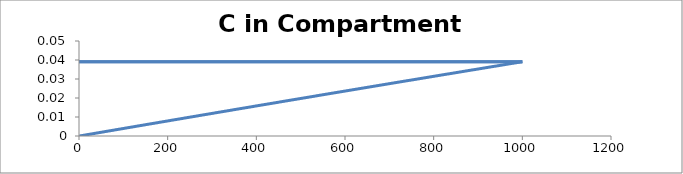
| Category | C - Sys 2 |
|---|---|
| 1.0 | 0 |
| 2.0 | 0 |
| 3.0 | 0 |
| 4.0 | 0 |
| 5.0 | 0 |
| 6.0 | 0 |
| 7.0 | 0 |
| 8.0 | 0 |
| 9.000000000000002 | 0 |
| 10.0 | 0 |
| 11.0 | 0 |
| 12.0 | 0 |
| 13.000000000000002 | 0 |
| 14.0 | 0.001 |
| 15.0 | 0.001 |
| 16.0 | 0.001 |
| 17.0 | 0.001 |
| 18.000000000000004 | 0.001 |
| 19.0 | 0.001 |
| 20.0 | 0.001 |
| 21.0 | 0.001 |
| 22.0 | 0.001 |
| 23.0 | 0.001 |
| 24.0 | 0.001 |
| 25.0 | 0.001 |
| 26.000000000000004 | 0.001 |
| 27.0 | 0.001 |
| 28.0 | 0.001 |
| 29.0 | 0.001 |
| 30.0 | 0.001 |
| 31.0 | 0.001 |
| 32.0 | 0.001 |
| 33.0 | 0.001 |
| 34.0 | 0.001 |
| 35.0 | 0.001 |
| 36.00000000000001 | 0.001 |
| 37.0 | 0.001 |
| 38.0 | 0.001 |
| 39.0 | 0.002 |
| 40.0 | 0.002 |
| 41.0 | 0.002 |
| 42.0 | 0.002 |
| 43.0 | 0.002 |
| 44.0 | 0.002 |
| 45.0 | 0.002 |
| 46.0 | 0.002 |
| 47.0 | 0.002 |
| 48.0 | 0.002 |
| 49.0 | 0.002 |
| 50.0 | 0.002 |
| 51.00000000000001 | 0.002 |
| 52.00000000000001 | 0.002 |
| 53.0 | 0.002 |
| 54.0 | 0.002 |
| 55.0 | 0.002 |
| 56.0 | 0.002 |
| 57.0 | 0.002 |
| 58.0 | 0.002 |
| 59.00000000000001 | 0.002 |
| 60.0 | 0.002 |
| 61.0 | 0.002 |
| 62.0 | 0.002 |
| 63.0 | 0.002 |
| 64.0 | 0.003 |
| 65.0 | 0.003 |
| 66.0 | 0.003 |
| 67.0 | 0.003 |
| 68.0 | 0.003 |
| 69.0 | 0.003 |
| 70.0 | 0.003 |
| 71.00000000000001 | 0.003 |
| 72.00000000000001 | 0.003 |
| 73.0 | 0.003 |
| 74.0 | 0.003 |
| 75.0 | 0.003 |
| 76.0 | 0.003 |
| 77.0 | 0.003 |
| 78.0 | 0.003 |
| 79.0 | 0.003 |
| 80.0 | 0.003 |
| 81.0 | 0.003 |
| 82.0 | 0.003 |
| 83.0 | 0.003 |
| 84.0 | 0.003 |
| 85.0 | 0.003 |
| 86.0 | 0.003 |
| 87.00000000000001 | 0.003 |
| 88.0 | 0.003 |
| 89.0 | 0.004 |
| 90.0 | 0.004 |
| 91.0 | 0.004 |
| 92.0 | 0.004 |
| 93.0 | 0.004 |
| 94.0 | 0.004 |
| 95.0 | 0.004 |
| 96.0 | 0.004 |
| 97.0 | 0.004 |
| 98.0 | 0.004 |
| 99.0 | 0.004 |
| 100.0 | 0.004 |
| 101.0 | 0.004 |
| 102.00000000000001 | 0.004 |
| 103.00000000000001 | 0.004 |
| 104.00000000000001 | 0.004 |
| 105.0 | 0.004 |
| 106.0 | 0.004 |
| 107.0 | 0.004 |
| 108.0 | 0.004 |
| 109.0 | 0.004 |
| 110.0 | 0.004 |
| 111.0 | 0.004 |
| 112.0 | 0.004 |
| 113.0 | 0.004 |
| 114.0 | 0.005 |
| 115.0 | 0.005 |
| 116.0 | 0.005 |
| 117.0 | 0.005 |
| 118.00000000000001 | 0.005 |
| 119.00000000000001 | 0.005 |
| 120.0 | 0.005 |
| 121.0 | 0.005 |
| 122.0 | 0.005 |
| 123.0 | 0.005 |
| 124.0 | 0.005 |
| 125.0 | 0.005 |
| 126.0 | 0.005 |
| 127.0 | 0.005 |
| 128.0 | 0.005 |
| 129.0 | 0.005 |
| 130.0 | 0.005 |
| 131.0 | 0.005 |
| 132.0 | 0.005 |
| 133.0 | 0.005 |
| 134.0 | 0.005 |
| 135.0 | 0.005 |
| 136.0 | 0.005 |
| 137.0 | 0.005 |
| 138.0 | 0.005 |
| 139.0 | 0.006 |
| 140.0 | 0.006 |
| 141.0 | 0.006 |
| 142.00000000000003 | 0.006 |
| 143.00000000000003 | 0.006 |
| 144.00000000000003 | 0.006 |
| 145.0 | 0.006 |
| 146.0 | 0.006 |
| 147.0 | 0.006 |
| 148.0 | 0.006 |
| 149.0 | 0.006 |
| 150.0 | 0.006 |
| 151.0 | 0.006 |
| 152.0 | 0.006 |
| 153.0 | 0.006 |
| 154.0 | 0.006 |
| 155.0 | 0.006 |
| 156.0 | 0.006 |
| 157.0 | 0.006 |
| 158.0 | 0.006 |
| 159.0 | 0.006 |
| 160.0 | 0.006 |
| 161.0 | 0.006 |
| 162.0 | 0.006 |
| 163.0 | 0.006 |
| 164.0 | 0.006 |
| 165.0 | 0.007 |
| 166.0 | 0.007 |
| 167.0 | 0.007 |
| 168.0 | 0.007 |
| 169.0 | 0.007 |
| 170.0 | 0.007 |
| 171.0 | 0.007 |
| 172.0 | 0.007 |
| 173.00000000000003 | 0.007 |
| 174.00000000000003 | 0.007 |
| 175.00000000000003 | 0.007 |
| 176.0 | 0.007 |
| 177.0 | 0.007 |
| 178.0 | 0.007 |
| 179.0 | 0.007 |
| 180.0 | 0.007 |
| 181.0 | 0.007 |
| 182.0 | 0.007 |
| 183.0 | 0.007 |
| 184.0 | 0.007 |
| 185.0 | 0.007 |
| 186.0 | 0.007 |
| 187.0 | 0.007 |
| 188.0 | 0.007 |
| 189.0 | 0.007 |
| 190.0 | 0.008 |
| 191.0 | 0.008 |
| 192.0 | 0.008 |
| 193.0 | 0.008 |
| 194.0 | 0.008 |
| 195.0 | 0.008 |
| 196.0 | 0.008 |
| 197.0 | 0.008 |
| 198.0 | 0.008 |
| 199.0 | 0.008 |
| 200.0 | 0.008 |
| 201.0 | 0.008 |
| 202.0 | 0.008 |
| 203.0 | 0.008 |
| 204.00000000000003 | 0.008 |
| 205.00000000000003 | 0.008 |
| 206.00000000000003 | 0.008 |
| 207.00000000000003 | 0.008 |
| 208.00000000000003 | 0.008 |
| 209.0 | 0.008 |
| 210.0 | 0.008 |
| 211.0 | 0.008 |
| 212.0 | 0.008 |
| 213.0 | 0.008 |
| 214.0 | 0.008 |
| 215.0 | 0.009 |
| 216.0 | 0.009 |
| 217.0 | 0.009 |
| 218.0 | 0.009 |
| 219.0 | 0.009 |
| 220.0 | 0.009 |
| 221.0 | 0.009 |
| 222.0 | 0.009 |
| 223.0 | 0.009 |
| 224.0 | 0.009 |
| 225.0 | 0.009 |
| 226.0 | 0.009 |
| 227.0 | 0.009 |
| 228.0 | 0.009 |
| 229.0 | 0.009 |
| 230.0 | 0.009 |
| 231.0 | 0.009 |
| 232.0 | 0.009 |
| 233.0 | 0.009 |
| 234.0 | 0.009 |
| 235.00000000000003 | 0.009 |
| 236.00000000000003 | 0.009 |
| 237.00000000000003 | 0.009 |
| 238.00000000000003 | 0.009 |
| 239.00000000000003 | 0.009 |
| 240.0 | 0.01 |
| 241.0 | 0.01 |
| 242.0 | 0.01 |
| 243.0 | 0.01 |
| 244.0 | 0.01 |
| 245.0 | 0.01 |
| 246.0 | 0.01 |
| 247.0 | 0.01 |
| 248.0 | 0.01 |
| 249.0 | 0.01 |
| 250.0 | 0.01 |
| 251.0 | 0.01 |
| 252.0 | 0.01 |
| 253.0 | 0.01 |
| 254.0 | 0.01 |
| 255.0 | 0.01 |
| 256.0 | 0.01 |
| 257.0 | 0.01 |
| 258.0 | 0.01 |
| 259.0 | 0.01 |
| 260.0 | 0.01 |
| 261.0 | 0.01 |
| 262.0 | 0.01 |
| 263.0 | 0.01 |
| 264.0 | 0.01 |
| 265.0 | 0.01 |
| 266.0 | 0.011 |
| 267.0 | 0.011 |
| 268.0 | 0.011 |
| 269.0 | 0.011 |
| 270.0 | 0.011 |
| 271.0 | 0.011 |
| 272.0 | 0.011 |
| 273.0 | 0.011 |
| 274.0 | 0.011 |
| 275.0 | 0.011 |
| 276.0 | 0.011 |
| 277.0 | 0.011 |
| 278.0 | 0.011 |
| 279.0 | 0.011 |
| 280.0 | 0.011 |
| 281.0 | 0.011 |
| 282.0 | 0.011 |
| 283.00000000000006 | 0.011 |
| 284.00000000000006 | 0.011 |
| 285.00000000000006 | 0.011 |
| 286.00000000000006 | 0.011 |
| 287.00000000000006 | 0.011 |
| 288.00000000000006 | 0.011 |
| 289.0 | 0.011 |
| 290.0 | 0.011 |
| 291.0 | 0.012 |
| 292.0 | 0.012 |
| 293.0 | 0.012 |
| 294.0 | 0.012 |
| 295.0 | 0.012 |
| 296.0 | 0.012 |
| 297.0 | 0.012 |
| 298.0 | 0.012 |
| 299.0 | 0.012 |
| 300.0 | 0.012 |
| 301.0 | 0.012 |
| 302.0 | 0.012 |
| 303.0 | 0.012 |
| 304.0 | 0.012 |
| 305.0 | 0.012 |
| 306.0 | 0.012 |
| 307.0 | 0.012 |
| 308.0 | 0.012 |
| 309.0 | 0.012 |
| 310.0 | 0.012 |
| 311.0 | 0.012 |
| 312.0 | 0.012 |
| 313.0 | 0.012 |
| 314.0 | 0.012 |
| 315.0 | 0.012 |
| 316.0 | 0.013 |
| 317.0 | 0.013 |
| 318.0 | 0.013 |
| 319.0 | 0.013 |
| 320.0 | 0.013 |
| 321.0 | 0.013 |
| 322.0 | 0.013 |
| 323.0 | 0.013 |
| 324.0 | 0.013 |
| 325.0 | 0.013 |
| 326.0 | 0.013 |
| 327.0 | 0.013 |
| 328.0 | 0.013 |
| 329.0 | 0.013 |
| 330.0 | 0.013 |
| 331.0 | 0.013 |
| 332.0 | 0.013 |
| 333.0 | 0.013 |
| 334.0 | 0.013 |
| 335.0 | 0.013 |
| 336.0 | 0.013 |
| 337.0 | 0.013 |
| 338.0 | 0.013 |
| 339.0 | 0.013 |
| 340.0 | 0.013 |
| 341.0 | 0.013 |
| 342.0 | 0.014 |
| 343.0 | 0.014 |
| 344.0 | 0.014 |
| 345.00000000000006 | 0.014 |
| 346.00000000000006 | 0.014 |
| 347.00000000000006 | 0.014 |
| 348.00000000000006 | 0.014 |
| 349.00000000000006 | 0.014 |
| 350.00000000000006 | 0.014 |
| 351.00000000000006 | 0.014 |
| 352.0 | 0.014 |
| 353.0 | 0.014 |
| 354.0 | 0.014 |
| 355.0 | 0.014 |
| 356.0 | 0.014 |
| 357.0 | 0.014 |
| 358.0 | 0.014 |
| 359.0 | 0.014 |
| 360.0 | 0.014 |
| 361.0 | 0.014 |
| 362.0 | 0.014 |
| 363.0 | 0.014 |
| 364.0 | 0.014 |
| 365.0 | 0.014 |
| 366.0 | 0.014 |
| 367.0 | 0.015 |
| 368.0 | 0.015 |
| 369.0 | 0.015 |
| 370.0 | 0.015 |
| 371.0 | 0.015 |
| 372.0 | 0.015 |
| 373.0 | 0.015 |
| 374.0 | 0.015 |
| 375.0 | 0.015 |
| 376.0 | 0.015 |
| 377.0 | 0.015 |
| 378.0 | 0.015 |
| 379.0 | 0.015 |
| 380.0 | 0.015 |
| 381.0 | 0.015 |
| 382.0 | 0.015 |
| 383.0 | 0.015 |
| 384.0 | 0.015 |
| 385.0 | 0.015 |
| 386.0 | 0.015 |
| 387.0 | 0.015 |
| 388.0 | 0.015 |
| 389.0 | 0.015 |
| 390.0 | 0.015 |
| 391.0 | 0.015 |
| 392.0 | 0.016 |
| 393.0 | 0.016 |
| 394.0 | 0.016 |
| 395.0 | 0.016 |
| 396.0 | 0.016 |
| 397.0 | 0.016 |
| 398.0 | 0.016 |
| 399.0 | 0.016 |
| 400.0 | 0.016 |
| 401.0 | 0.016 |
| 402.0 | 0.016 |
| 403.0 | 0.016 |
| 404.0 | 0.016 |
| 405.0 | 0.016 |
| 406.0 | 0.016 |
| 407.0 | 0.016 |
| 408.00000000000006 | 0.016 |
| 409.00000000000006 | 0.016 |
| 410.00000000000006 | 0.016 |
| 411.00000000000006 | 0.016 |
| 412.00000000000006 | 0.016 |
| 413.00000000000006 | 0.016 |
| 414.00000000000006 | 0.016 |
| 415.00000000000006 | 0.016 |
| 416.00000000000006 | 0.016 |
| 417.0 | 0.016 |
| 418.0 | 0.017 |
| 419.0 | 0.017 |
| 420.0 | 0.017 |
| 421.0 | 0.017 |
| 422.0 | 0.017 |
| 423.0 | 0.017 |
| 424.0 | 0.017 |
| 425.0 | 0.017 |
| 426.0 | 0.017 |
| 427.0 | 0.017 |
| 428.0 | 0.017 |
| 429.0 | 0.017 |
| 430.0 | 0.017 |
| 431.0 | 0.017 |
| 432.0 | 0.017 |
| 433.0 | 0.017 |
| 434.0 | 0.017 |
| 435.0 | 0.017 |
| 436.0 | 0.017 |
| 437.0 | 0.017 |
| 438.0 | 0.017 |
| 439.0 | 0.017 |
| 440.0 | 0.017 |
| 441.0 | 0.017 |
| 442.0 | 0.017 |
| 443.0 | 0.018 |
| 444.0 | 0.018 |
| 445.0 | 0.018 |
| 446.0 | 0.018 |
| 447.0 | 0.018 |
| 448.0 | 0.018 |
| 449.0 | 0.018 |
| 450.0 | 0.018 |
| 451.0 | 0.018 |
| 452.0 | 0.018 |
| 453.0 | 0.018 |
| 454.0 | 0.018 |
| 455.0 | 0.018 |
| 456.0 | 0.018 |
| 457.0 | 0.018 |
| 458.0 | 0.018 |
| 459.0 | 0.018 |
| 460.0 | 0.018 |
| 461.0 | 0.018 |
| 462.0 | 0.018 |
| 463.0 | 0.018 |
| 464.0 | 0.018 |
| 465.0 | 0.018 |
| 466.0 | 0.018 |
| 467.0 | 0.018 |
| 468.0 | 0.018 |
| 469.0 | 0.019 |
| 470.00000000000006 | 0.019 |
| 471.00000000000006 | 0.019 |
| 472.00000000000006 | 0.019 |
| 473.00000000000006 | 0.019 |
| 474.00000000000006 | 0.019 |
| 475.00000000000006 | 0.019 |
| 476.00000000000006 | 0.019 |
| 477.00000000000006 | 0.019 |
| 478.00000000000006 | 0.019 |
| 479.00000000000006 | 0.019 |
| 480.0 | 0.019 |
| 481.0 | 0.019 |
| 482.0 | 0.019 |
| 483.0 | 0.019 |
| 484.0 | 0.019 |
| 485.0 | 0.019 |
| 486.0 | 0.019 |
| 487.0 | 0.019 |
| 488.0 | 0.019 |
| 489.0 | 0.019 |
| 490.0 | 0.019 |
| 491.0 | 0.019 |
| 492.0 | 0.019 |
| 493.0 | 0.019 |
| 494.0 | 0.02 |
| 495.0 | 0.02 |
| 496.0 | 0.02 |
| 497.0 | 0.02 |
| 498.0 | 0.02 |
| 499.0 | 0.02 |
| 500.0 | 0.02 |
| 501.0 | 0.02 |
| 502.0 | 0.02 |
| 503.0 | 0.02 |
| 504.0 | 0.02 |
| 505.0 | 0.02 |
| 506.0 | 0.02 |
| 507.0 | 0.02 |
| 508.0 | 0.02 |
| 509.0 | 0.02 |
| 510.0 | 0.02 |
| 511.0 | 0.02 |
| 512.0 | 0.02 |
| 513.0 | 0.02 |
| 514.0 | 0.02 |
| 515.0 | 0.02 |
| 516.0 | 0.02 |
| 517.0 | 0.02 |
| 518.0 | 0.02 |
| 519.0 | 0.02 |
| 520.0 | 0.021 |
| 521.0 | 0.021 |
| 522.0 | 0.021 |
| 523.0 | 0.021 |
| 524.0 | 0.021 |
| 525.0 | 0.021 |
| 526.0 | 0.021 |
| 527.0 | 0.021 |
| 528.0 | 0.021 |
| 529.0 | 0.021 |
| 530.0 | 0.021 |
| 531.0 | 0.021 |
| 532.0 | 0.021 |
| 533.0 | 0.021 |
| 534.0 | 0.021 |
| 535.0 | 0.021 |
| 536.0 | 0.021 |
| 537.0 | 0.021 |
| 538.0 | 0.021 |
| 539.0 | 0.021 |
| 540.0 | 0.021 |
| 541.0 | 0.021 |
| 542.0 | 0.021 |
| 543.0 | 0.021 |
| 544.0 | 0.021 |
| 545.0 | 0.022 |
| 546.0 | 0.022 |
| 547.0 | 0.022 |
| 548.0 | 0.022 |
| 549.0 | 0.022 |
| 550.0 | 0.022 |
| 551.0 | 0.022 |
| 552.0 | 0.022 |
| 553.0 | 0.022 |
| 554.0 | 0.022 |
| 555.0 | 0.022 |
| 556.0 | 0.022 |
| 557.0 | 0.022 |
| 558.0 | 0.022 |
| 559.0 | 0.022 |
| 560.0 | 0.022 |
| 561.0 | 0.022 |
| 562.0 | 0.022 |
| 563.0 | 0.022 |
| 564.0 | 0.022 |
| 565.0000000000001 | 0.022 |
| 566.0000000000001 | 0.022 |
| 567.0000000000001 | 0.022 |
| 568.0000000000001 | 0.022 |
| 569.0000000000001 | 0.022 |
| 570.0000000000001 | 0.022 |
| 571.0000000000001 | 0.023 |
| 572.0000000000001 | 0.023 |
| 573.0000000000001 | 0.023 |
| 574.0000000000001 | 0.023 |
| 575.0000000000001 | 0.023 |
| 576.0000000000001 | 0.023 |
| 577.0 | 0.023 |
| 578.0 | 0.023 |
| 579.0 | 0.023 |
| 580.0 | 0.023 |
| 581.0 | 0.023 |
| 582.0 | 0.023 |
| 583.0 | 0.023 |
| 584.0 | 0.023 |
| 585.0 | 0.023 |
| 586.0 | 0.023 |
| 587.0 | 0.023 |
| 588.0 | 0.023 |
| 589.0 | 0.023 |
| 590.0 | 0.023 |
| 591.0 | 0.023 |
| 592.0 | 0.023 |
| 593.0 | 0.023 |
| 594.0 | 0.023 |
| 595.0 | 0.023 |
| 596.0 | 0.023 |
| 597.0 | 0.024 |
| 598.0 | 0.024 |
| 599.0 | 0.024 |
| 600.0 | 0.024 |
| 601.0 | 0.024 |
| 602.0 | 0.024 |
| 603.0 | 0.024 |
| 604.0 | 0.024 |
| 605.0 | 0.024 |
| 606.0 | 0.024 |
| 607.0 | 0.024 |
| 608.0 | 0.024 |
| 609.0 | 0.024 |
| 610.0 | 0.024 |
| 611.0 | 0.024 |
| 612.0 | 0.024 |
| 613.0 | 0.024 |
| 614.0 | 0.024 |
| 615.0 | 0.024 |
| 616.0 | 0.024 |
| 617.0 | 0.024 |
| 618.0 | 0.024 |
| 619.0 | 0.024 |
| 620.0 | 0.024 |
| 621.0 | 0.024 |
| 622.0 | 0.025 |
| 623.0 | 0.025 |
| 624.0 | 0.025 |
| 625.0 | 0.025 |
| 626.0 | 0.025 |
| 627.0 | 0.025 |
| 628.0 | 0.025 |
| 629.0 | 0.025 |
| 630.0 | 0.025 |
| 631.0 | 0.025 |
| 632.0 | 0.025 |
| 633.0 | 0.025 |
| 634.0 | 0.025 |
| 635.0 | 0.025 |
| 636.0 | 0.025 |
| 637.0 | 0.025 |
| 638.0 | 0.025 |
| 639.0 | 0.025 |
| 640.0 | 0.025 |
| 641.0 | 0.025 |
| 642.0 | 0.025 |
| 643.0 | 0.025 |
| 644.0 | 0.025 |
| 645.0 | 0.025 |
| 646.0 | 0.025 |
| 647.0 | 0.025 |
| 648.0 | 0.026 |
| 649.0 | 0.026 |
| 650.0 | 0.026 |
| 651.0 | 0.026 |
| 652.0 | 0.026 |
| 653.0 | 0.026 |
| 654.0 | 0.026 |
| 655.0 | 0.026 |
| 656.0 | 0.026 |
| 657.0 | 0.026 |
| 658.0 | 0.026 |
| 659.0 | 0.026 |
| 660.0 | 0.026 |
| 661.0 | 0.026 |
| 662.0 | 0.026 |
| 663.0 | 0.026 |
| 664.0 | 0.026 |
| 665.0 | 0.026 |
| 666.0 | 0.026 |
| 667.0 | 0.026 |
| 668.0 | 0.026 |
| 669.0 | 0.026 |
| 670.0 | 0.026 |
| 671.0 | 0.026 |
| 672.0 | 0.026 |
| 673.0 | 0.026 |
| 674.0 | 0.027 |
| 675.0 | 0.027 |
| 676.0 | 0.027 |
| 677.0 | 0.027 |
| 678.0 | 0.027 |
| 679.0 | 0.027 |
| 680.0 | 0.027 |
| 681.0 | 0.027 |
| 682.0 | 0.027 |
| 683.0 | 0.027 |
| 684.0 | 0.027 |
| 685.0 | 0.027 |
| 686.0 | 0.027 |
| 687.0 | 0.027 |
| 688.0 | 0.027 |
| 689.0 | 0.027 |
| 690.0000000000001 | 0.027 |
| 691.0000000000001 | 0.027 |
| 692.0000000000001 | 0.027 |
| 693.0000000000001 | 0.027 |
| 694.0000000000001 | 0.027 |
| 695.0000000000001 | 0.027 |
| 696.0000000000001 | 0.027 |
| 697.0000000000001 | 0.027 |
| 698.0000000000001 | 0.027 |
| 699.0000000000001 | 0.027 |
| 700.0000000000001 | 0.028 |
| 701.0000000000001 | 0.028 |
| 702.0000000000001 | 0.028 |
| 703.0000000000001 | 0.028 |
| 704.0 | 0.028 |
| 705.0 | 0.028 |
| 706.0 | 0.028 |
| 707.0 | 0.028 |
| 708.0 | 0.028 |
| 709.0 | 0.028 |
| 710.0 | 0.028 |
| 711.0 | 0.028 |
| 712.0 | 0.028 |
| 713.0 | 0.028 |
| 714.0 | 0.028 |
| 715.0 | 0.028 |
| 716.0 | 0.028 |
| 717.0 | 0.028 |
| 718.0 | 0.028 |
| 719.0 | 0.028 |
| 720.0 | 0.028 |
| 721.0 | 0.028 |
| 722.0 | 0.028 |
| 723.0 | 0.028 |
| 724.0 | 0.028 |
| 725.0 | 0.029 |
| 726.0 | 0.029 |
| 727.0 | 0.029 |
| 728.0 | 0.029 |
| 729.0 | 0.029 |
| 730.0 | 0.029 |
| 731.0 | 0.029 |
| 732.0 | 0.029 |
| 733.0 | 0.029 |
| 734.0 | 0.029 |
| 735.0 | 0.029 |
| 736.0 | 0.029 |
| 737.0 | 0.029 |
| 738.0 | 0.029 |
| 739.0 | 0.029 |
| 740.0 | 0.029 |
| 741.0 | 0.029 |
| 742.0 | 0.029 |
| 743.0 | 0.029 |
| 744.0 | 0.029 |
| 745.0 | 0.029 |
| 746.0 | 0.029 |
| 747.0 | 0.029 |
| 748.0 | 0.029 |
| 749.0 | 0.029 |
| 750.0 | 0.029 |
| 751.0 | 0.03 |
| 752.0 | 0.03 |
| 753.0 | 0.03 |
| 754.0 | 0.03 |
| 755.0 | 0.03 |
| 756.0 | 0.03 |
| 757.0 | 0.03 |
| 758.0 | 0.03 |
| 759.0 | 0.03 |
| 760.0 | 0.03 |
| 761.0 | 0.03 |
| 762.0 | 0.03 |
| 763.0 | 0.03 |
| 764.0 | 0.03 |
| 765.0 | 0.03 |
| 766.0 | 0.03 |
| 767.0 | 0.03 |
| 768.0 | 0.03 |
| 769.0 | 0.03 |
| 770.0 | 0.03 |
| 771.0 | 0.03 |
| 772.0 | 0.03 |
| 773.0 | 0.03 |
| 774.0 | 0.03 |
| 775.0 | 0.03 |
| 776.0 | 0.03 |
| 777.0 | 0.031 |
| 778.0 | 0.031 |
| 779.0 | 0.031 |
| 780.0 | 0.031 |
| 781.0 | 0.031 |
| 782.0 | 0.031 |
| 783.0 | 0.031 |
| 784.0 | 0.031 |
| 785.0 | 0.031 |
| 786.0 | 0.031 |
| 787.0 | 0.031 |
| 788.0 | 0.031 |
| 789.0 | 0.031 |
| 790.0 | 0.031 |
| 791.0 | 0.031 |
| 792.0 | 0.031 |
| 793.0 | 0.031 |
| 794.0 | 0.031 |
| 795.0 | 0.031 |
| 796.0 | 0.031 |
| 797.0 | 0.031 |
| 798.0 | 0.031 |
| 799.0 | 0.031 |
| 800.0 | 0.031 |
| 801.0 | 0.031 |
| 802.0 | 0.031 |
| 803.0 | 0.032 |
| 804.0 | 0.032 |
| 805.0 | 0.032 |
| 806.0 | 0.032 |
| 807.0 | 0.032 |
| 808.0 | 0.032 |
| 809.0 | 0.032 |
| 810.0 | 0.032 |
| 811.0 | 0.032 |
| 812.0 | 0.032 |
| 813.0 | 0.032 |
| 814.0 | 0.032 |
| 815.0000000000001 | 0.032 |
| 816.0000000000001 | 0.032 |
| 817.0000000000001 | 0.032 |
| 818.0000000000001 | 0.032 |
| 819.0000000000001 | 0.032 |
| 820.0000000000001 | 0.032 |
| 821.0000000000001 | 0.032 |
| 822.0000000000001 | 0.032 |
| 823.0000000000001 | 0.032 |
| 824.0000000000001 | 0.032 |
| 825.0000000000001 | 0.032 |
| 826.0000000000001 | 0.032 |
| 827.0000000000001 | 0.032 |
| 828.0000000000001 | 0.032 |
| 829.0000000000001 | 0.033 |
| 830.0000000000001 | 0.033 |
| 831.0000000000001 | 0.033 |
| 832.0000000000001 | 0.033 |
| 833.0 | 0.033 |
| 834.0 | 0.033 |
| 835.0 | 0.033 |
| 836.0 | 0.033 |
| 837.0 | 0.033 |
| 838.0 | 0.033 |
| 839.0 | 0.033 |
| 840.0 | 0.033 |
| 841.0 | 0.033 |
| 842.0 | 0.033 |
| 843.0 | 0.033 |
| 844.0 | 0.033 |
| 845.0 | 0.033 |
| 846.0 | 0.033 |
| 847.0 | 0.033 |
| 848.0 | 0.033 |
| 849.0 | 0.033 |
| 850.0 | 0.033 |
| 851.0 | 0.033 |
| 852.0 | 0.033 |
| 853.0 | 0.033 |
| 854.0 | 0.033 |
| 855.0 | 0.034 |
| 856.0 | 0.034 |
| 857.0 | 0.034 |
| 858.0 | 0.034 |
| 859.0 | 0.034 |
| 860.0 | 0.034 |
| 861.0 | 0.034 |
| 862.0 | 0.034 |
| 863.0 | 0.034 |
| 864.0 | 0.034 |
| 865.0 | 0.034 |
| 866.0 | 0.034 |
| 867.0 | 0.034 |
| 868.0 | 0.034 |
| 869.0 | 0.034 |
| 870.0 | 0.034 |
| 871.0 | 0.034 |
| 872.0 | 0.034 |
| 873.0 | 0.034 |
| 874.0 | 0.034 |
| 875.0 | 0.034 |
| 876.0 | 0.034 |
| 877.0 | 0.034 |
| 878.0 | 0.034 |
| 879.0 | 0.034 |
| 880.0 | 0.034 |
| 881.0 | 0.035 |
| 882.0 | 0.035 |
| 883.0 | 0.035 |
| 884.0 | 0.035 |
| 885.0 | 0.035 |
| 886.0 | 0.035 |
| 887.0 | 0.035 |
| 888.0 | 0.035 |
| 889.0 | 0.035 |
| 890.0 | 0.035 |
| 891.0 | 0.035 |
| 892.0 | 0.035 |
| 893.0 | 0.035 |
| 894.0 | 0.035 |
| 895.0 | 0.035 |
| 896.0 | 0.035 |
| 897.0 | 0.035 |
| 898.0 | 0.035 |
| 899.0 | 0.035 |
| 900.0 | 0.035 |
| 901.0 | 0.035 |
| 902.0 | 0.035 |
| 903.0 | 0.035 |
| 904.0 | 0.035 |
| 905.0 | 0.035 |
| 906.0 | 0.035 |
| 907.0 | 0.036 |
| 908.0 | 0.036 |
| 909.0 | 0.036 |
| 910.0 | 0.036 |
| 911.0 | 0.036 |
| 912.0 | 0.036 |
| 913.0 | 0.036 |
| 914.0 | 0.036 |
| 915.0 | 0.036 |
| 916.0 | 0.036 |
| 917.0 | 0.036 |
| 918.0 | 0.036 |
| 919.0 | 0.036 |
| 920.0 | 0.036 |
| 921.0 | 0.036 |
| 922.0 | 0.036 |
| 923.0 | 0.036 |
| 924.0 | 0.036 |
| 925.0 | 0.036 |
| 926.0 | 0.036 |
| 927.0 | 0.036 |
| 928.0 | 0.036 |
| 929.0 | 0.036 |
| 930.0 | 0.036 |
| 931.0 | 0.036 |
| 932.0 | 0.036 |
| 933.0 | 0.037 |
| 934.0 | 0.037 |
| 935.0 | 0.037 |
| 936.0 | 0.037 |
| 937.0 | 0.037 |
| 938.0 | 0.037 |
| 939.0 | 0.037 |
| 940.0000000000001 | 0.037 |
| 941.0000000000001 | 0.037 |
| 942.0000000000001 | 0.037 |
| 943.0000000000001 | 0.037 |
| 944.0000000000001 | 0.037 |
| 945.0000000000001 | 0.037 |
| 946.0000000000001 | 0.037 |
| 947.0000000000001 | 0.037 |
| 948.0000000000001 | 0.037 |
| 949.0000000000001 | 0.037 |
| 950.0000000000001 | 0.037 |
| 951.0000000000001 | 0.037 |
| 952.0000000000001 | 0.037 |
| 953.0000000000001 | 0.037 |
| 954.0000000000001 | 0.037 |
| 955.0000000000001 | 0.037 |
| 956.0000000000001 | 0.037 |
| 957.0000000000001 | 0.037 |
| 958.0000000000001 | 0.037 |
| 959.0000000000001 | 0.038 |
| 960.0 | 0.038 |
| 961.0 | 0.038 |
| 962.0 | 0.038 |
| 963.0 | 0.038 |
| 964.0 | 0.038 |
| 965.0 | 0.038 |
| 966.0 | 0.038 |
| 967.0 | 0.038 |
| 968.0 | 0.038 |
| 969.0 | 0.038 |
| 970.0 | 0.038 |
| 971.0 | 0.038 |
| 972.0 | 0.038 |
| 973.0 | 0.038 |
| 974.0 | 0.038 |
| 975.0 | 0.038 |
| 976.0 | 0.038 |
| 977.0 | 0.038 |
| 978.0 | 0.038 |
| 979.0 | 0.038 |
| 980.0 | 0.038 |
| 981.0 | 0.038 |
| 982.0 | 0.038 |
| 983.0 | 0.038 |
| 984.0 | 0.038 |
| 985.0 | 0.039 |
| 986.0 | 0.039 |
| 987.0 | 0.039 |
| 988.0 | 0.039 |
| 989.0 | 0.039 |
| 990.0 | 0.039 |
| 991.0 | 0.039 |
| 992.0 | 0.039 |
| 993.0 | 0.039 |
| 994.0 | 0.039 |
| 995.0 | 0.039 |
| 996.0 | 0.039 |
| 997.0 | 0.039 |
| 998.0 | 0.039 |
| 999.0 | 0.039 |
| 1000.0 | 0.039 |